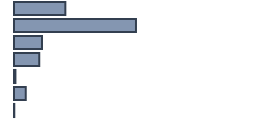
| Category | Percentatge |
|---|---|
| 0 | 21.392 |
| 1 | 50.822 |
| 2 | 11.714 |
| 3 | 10.486 |
| 4 | 0.594 |
| 5 | 4.872 |
| 6 | 0.12 |